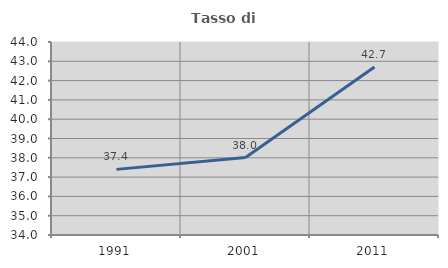
| Category | Tasso di occupazione   |
|---|---|
| 1991.0 | 37.4 |
| 2001.0 | 38.014 |
| 2011.0 | 42.701 |